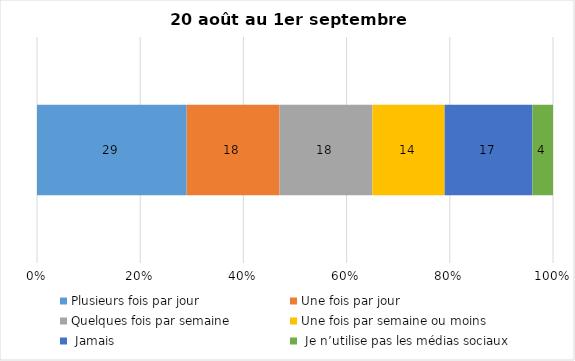
| Category | Plusieurs fois par jour | Une fois par jour | Quelques fois par semaine   | Une fois par semaine ou moins   |  Jamais   |  Je n’utilise pas les médias sociaux |
|---|---|---|---|---|---|---|
| 0 | 29 | 18 | 18 | 14 | 17 | 4 |